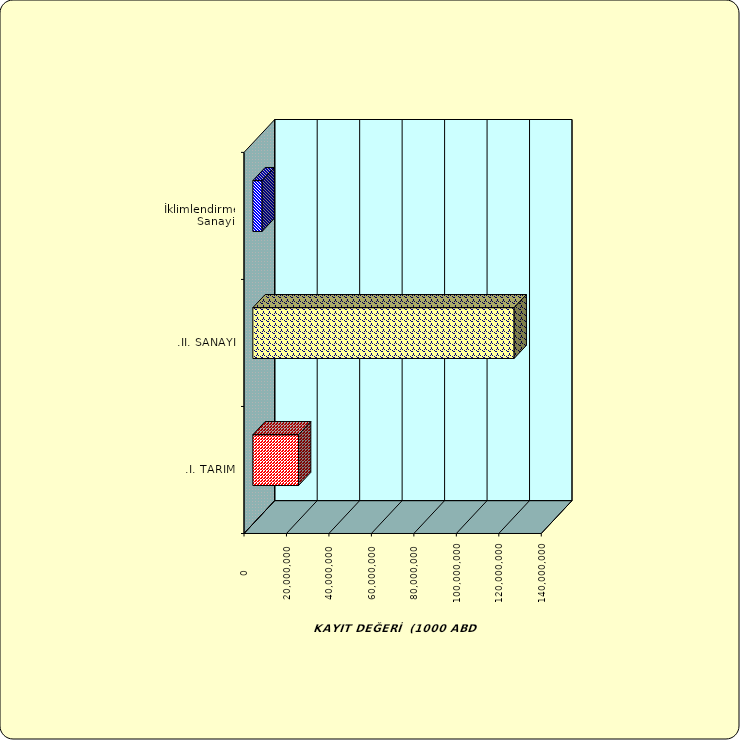
| Category | Series 0 |
|---|---|
| .I. TARIM | 21516622.711 |
| .II. SANAYİ | 123054229.039 |
|  İklimlendirme Sanayii | 4367700.116 |